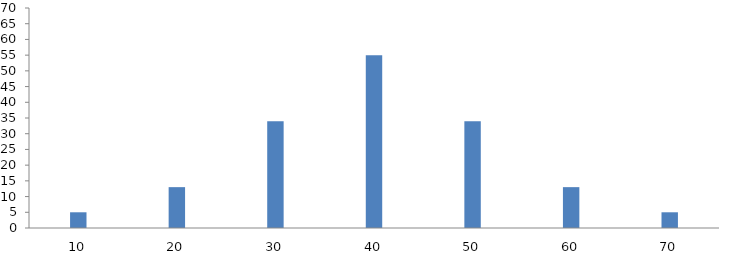
| Category | Series 0 |
|---|---|
| 10.0 | 5 |
| 20.0 | 13 |
| 30.0 | 34 |
| 40.0 | 55 |
| 50.0 | 34 |
| 60.0 | 13 |
| 70.0 | 5 |